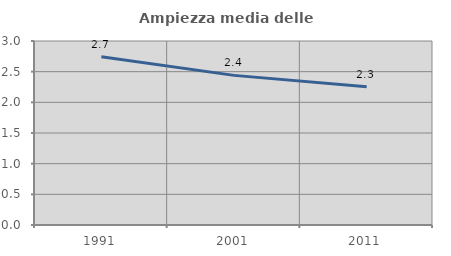
| Category | Ampiezza media delle famiglie |
|---|---|
| 1991.0 | 2.742 |
| 2001.0 | 2.439 |
| 2011.0 | 2.252 |